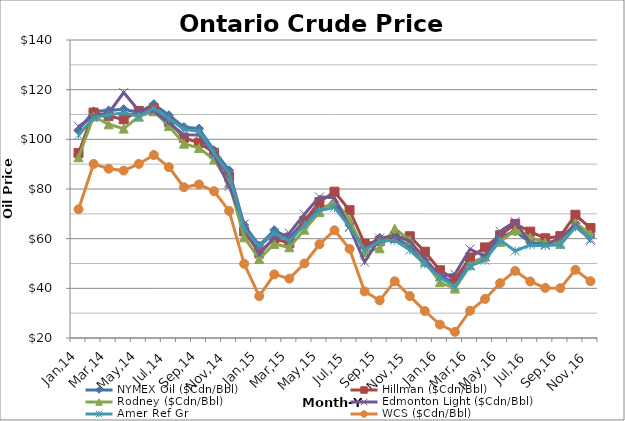
| Category | NYMEX Oil ($Cdn/Bbl) | Hillman ($Cdn/Bbl) | Rodney ($Cdn/Bbl) | Edmonton Light ($Cdn/Bbl) | Amer Ref Gr | WCS ($Cdn/Bbl) |
|---|---|---|---|---|---|---|
| Jan,14 | 103.689 | 94.51 | 92.79 | 105.194 | 101.626 | 71.837 |
| Feb,14 | 111.276 | 110.78 | 109.19 | 109.367 | 108.827 | 90.091 |
| Mar,14 | 111.644 | 109.41 | 106.06 | 110.58 | 109.846 | 88.165 |
| Apr,14 | 112.148 | 108.05 | 104.33 | 118.836 | 110.703 | 87.405 |
| May,14 | 110.852 | 111.428 | 109.129 | 111.489 | 109.268 | 90.081 |
| Jun,14 | 114.161 | 112.423 | 111.304 | 111.308 | 112.591 | 93.689 |
| Jul,14 | 109.729 | 107.18 | 105.369 | 106.561 | 108.358 | 88.8 |
| Aug,14 | 104.943 | 100.657 | 98.242 | 101.861 | 103.997 | 80.701 |
| Sep,14 | 104.323 | 98.601 | 96.537 | 101.786 | 103.264 | 81.839 |
| Oct,14 | 95.565 | 94.588 | 91.866 | 93.765 | 94.58 | 79.121 |
| Nov,14 | 87.51 | 84.999 | 82.436 | 81.091 | 86.171 | 71.176 |
| Dec,14 | 65.483 | 62.924 | 60.543 | 65.915 | 64.092 | 49.861 |
| Jan,15 | 57.25 | 54.357 | 51.845 | 53.64 | 56.827 | 36.846 |
| Feb,15 | 63.404 | 60.052 | 57.876 | 60.39 | 62.329 | 45.636 |
| Mar,15 | 60.345 | 58.155 | 56.532 | 62.2 | 58.97 | 43.91 |
| Apr,15 | 67.162 | 67.162 | 63.617 | 69.85 | 65.581 | 49.999 |
| May,15 | 72.305 | 74.732 | 70.676 | 76.83 | 71.209 | 57.768 |
| Jun,15 | 73.919 | 78.907 | 75.411 | 76.44 | 72.597 | 63.369 |
| Jul,15 | 65.429 | 71.455 | 67.666 | 64.58 | 64.8 | 55.873 |
| Aug,15 | 56.375 | 57.995 | 54.645 | 50.57 | 55.455 | 38.746 |
| Sep,15 | 60.341 | 58.989 | 56.133 | 60.192 | 58.971 | 35.17 |
| Oct,15 | 60.502 | 60.314 | 64.057 | 61.177 | 59.367 | 42.845 |
| Nov,15 | 56.981 | 60.973 | 59.446 | 59.066 | 55.419 | 36.878 |
| Dec,15 | 51.186 | 54.753 | 50.75 | 52.024 | 49.769 | 30.865 |
| Jan,16 | 45.146 | 47.285 | 42.519 | 44.914 | 44.461 | 25.403 |
| Feb,16 | 42.219 | 43.589 | 39.895 | 45.722 | 40.815 | 22.477 |
| Mar,16 | 50.142 | 52.422 | 49.314 | 55.803 | 49.009 | 30.988 |
| Apr,16 | 52.688 | 56.489 | 52.845 | 52.914 | 51.285 | 35.719 |
| May,16 | 60.593 | 61.383 | 58.721 | 62.96 | 59.428 | 42.104 |
| Jun,16 | 62.957 | 65.933 | 63.412 | 66.89 | 55.044 | 46.999 |
| Jul,16 | 58.402 | 62.836 | 60.504 | 58.2 | 57.457 | 42.76 |
| Aug,16 | 58.235 | 60.159 | 58.426 | 57.54 | 57.205 | 40.17 |
| Sep,16 | 59.2 | 61.012 | 57.906 | 60.34 | 57.582 | 40.081 |
| Oct,16 | 66.149 | 69.615 | 66.401 | 65.655 | 64.675 | 47.459 |
| Nov,16 | 61.53 | 64.262 | 61.841 | 59.252 | 59.938 | 42.876 |